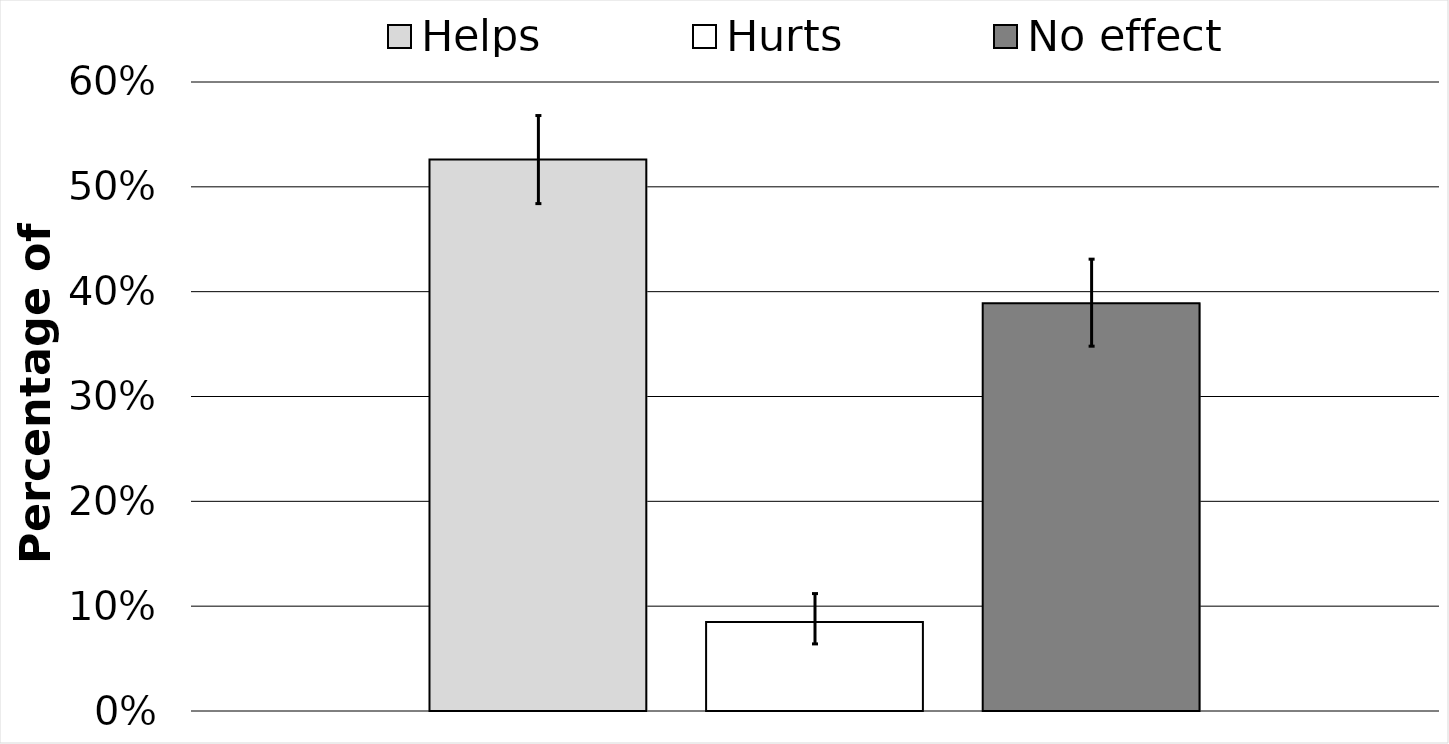
| Category | Helps | Hurts | No effect |
|---|---|---|---|
| 0 | 0.526 | 0.085 | 0.389 |